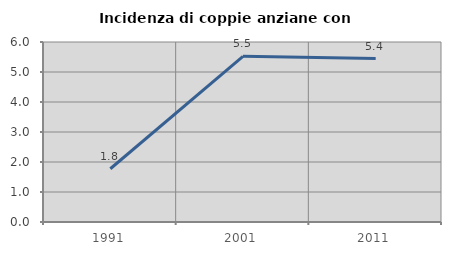
| Category | Incidenza di coppie anziane con figli |
|---|---|
| 1991.0 | 1.775 |
| 2001.0 | 5.521 |
| 2011.0 | 5.449 |